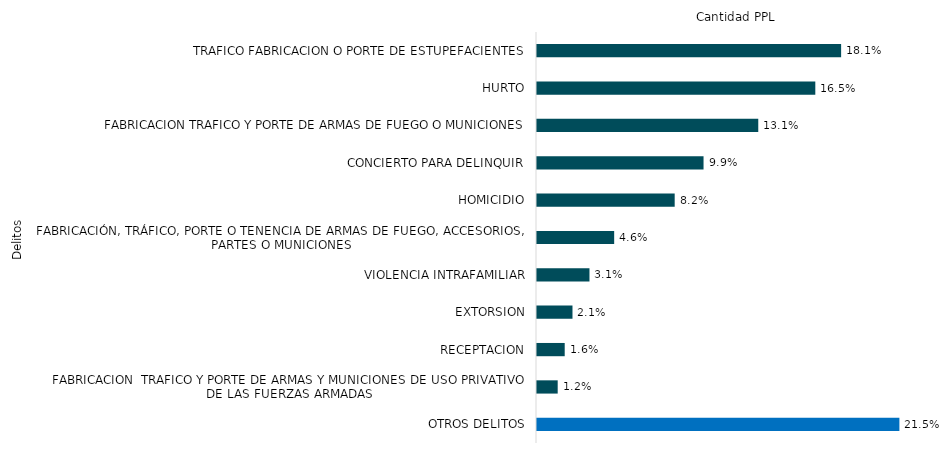
| Category | Series 0 |
|---|---|
| TRAFICO FABRICACION O PORTE DE ESTUPEFACIENTES | 15093 |
| HURTO | 13812 |
| FABRICACION TRAFICO Y PORTE DE ARMAS DE FUEGO O MUNICIONES | 10981 |
| CONCIERTO PARA DELINQUIR | 8265 |
| HOMICIDIO | 6833 |
| FABRICACIÓN, TRÁFICO, PORTE O TENENCIA DE ARMAS DE FUEGO, ACCESORIOS, PARTES O MUNICIONES | 3830 |
| VIOLENCIA INTRAFAMILIAR | 2604 |
| EXTORSION | 1761 |
| RECEPTACION | 1375 |
| FABRICACION  TRAFICO Y PORTE DE ARMAS Y MUNICIONES DE USO PRIVATIVO DE LAS FUERZAS ARMADAS | 1027 |
| OTROS DELITOS | 17985 |